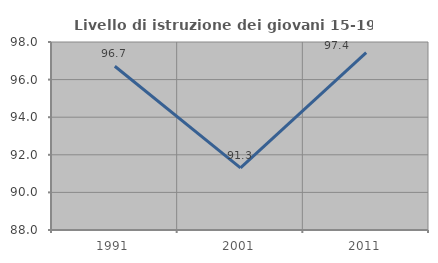
| Category | Livello di istruzione dei giovani 15-19 anni |
|---|---|
| 1991.0 | 96.711 |
| 2001.0 | 91.304 |
| 2011.0 | 97.436 |